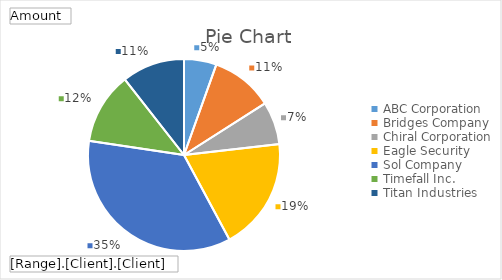
| Category | Total |
|---|---|
| ABC Corporation | 40882304 |
| Bridges Company | 78601479 |
| Chiral Corporation | 54004604 |
| Eagle Security | 141877636 |
| Sol Company | 263379609 |
| Timefall Inc. | 90238331 |
| Titan Industries | 79147018 |